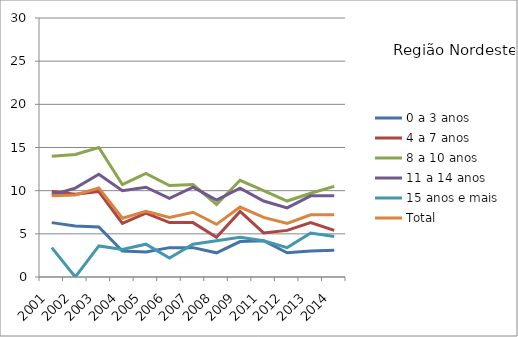
| Category | 0 a 3 anos | 4 a 7 anos | 8 a 10 anos | 11 a 14 anos | 15 anos e mais | Total |
|---|---|---|---|---|---|---|
| 2001.0 | 6.3 | 9.9 | 14 | 9.5 | 3.4 | 9.4 |
| 2002.0 | 5.9 | 9.6 | 14.2 | 10.3 | 0 | 9.5 |
| 2003.0 | 5.8 | 9.9 | 15 | 11.9 | 3.6 | 10.3 |
| 2004.0 | 3 | 6.2 | 10.7 | 10 | 3.2 | 6.8 |
| 2005.0 | 2.9 | 7.4 | 12 | 10.4 | 3.8 | 7.6 |
| 2006.0 | 3.4 | 6.3 | 10.6 | 9.1 | 2.2 | 6.9 |
| 2007.0 | 3.4 | 6.3 | 10.7 | 10.4 | 3.8 | 7.5 |
| 2008.0 | 2.8 | 4.6 | 8.4 | 8.9 | 4.2 | 6.1 |
| 2009.0 | 4.1 | 7.6 | 11.2 | 10.3 | 4.6 | 8.1 |
| 2011.0 | 4.2 | 5.1 | 10 | 8.8 | 4.2 | 6.9 |
| 2012.0 | 2.8 | 5.4 | 8.8 | 8 | 3.4 | 6.2 |
| 2013.0 | 3 | 6.3 | 9.7 | 9.4 | 5.1 | 7.2 |
| 2014.0 | 3.1 | 5.4 | 10.5 | 9.4 | 4.7 | 7.2 |